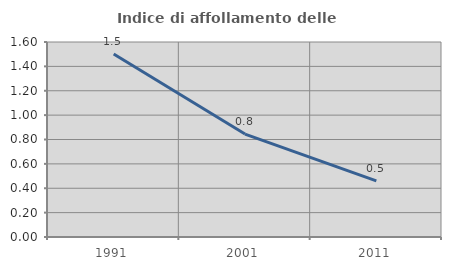
| Category | Indice di affollamento delle abitazioni  |
|---|---|
| 1991.0 | 1.502 |
| 2001.0 | 0.844 |
| 2011.0 | 0.46 |